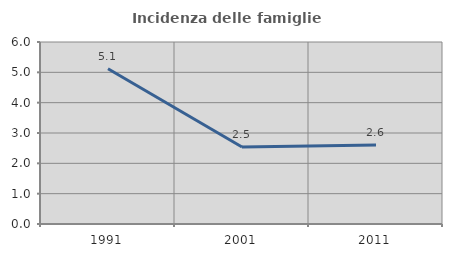
| Category | Incidenza delle famiglie numerose |
|---|---|
| 1991.0 | 5.117 |
| 2001.0 | 2.537 |
| 2011.0 | 2.607 |